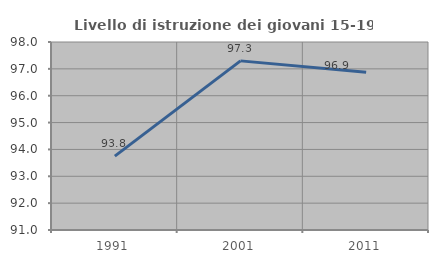
| Category | Livello di istruzione dei giovani 15-19 anni |
|---|---|
| 1991.0 | 93.75 |
| 2001.0 | 97.297 |
| 2011.0 | 96.875 |